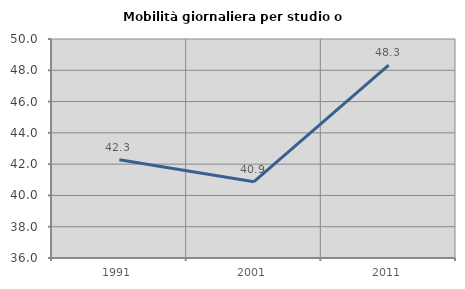
| Category | Mobilità giornaliera per studio o lavoro |
|---|---|
| 1991.0 | 42.286 |
| 2001.0 | 40.88 |
| 2011.0 | 48.333 |